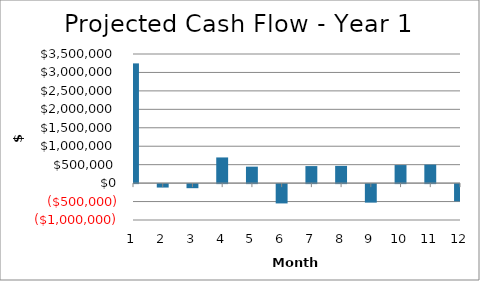
| Category | Year 1 |
|---|---|
| 1.0 | 3245502.761 |
| 2.0 | -93234.264 |
| 3.0 | -110560.338 |
| 4.0 | 695863.48 |
| 5.0 | 445895.333 |
| 6.0 | -523577.166 |
| 7.0 | 461728.99 |
| 8.0 | 467228.305 |
| 9.0 | -501664.396 |
| 10.0 | 489649.375 |
| 11.0 | 501176.797 |
| 12.0 | -467074.574 |